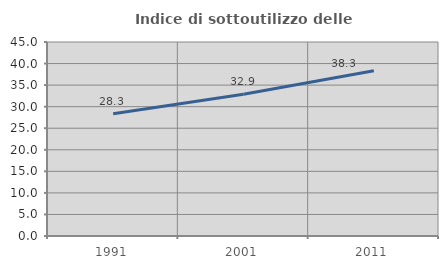
| Category | Indice di sottoutilizzo delle abitazioni  |
|---|---|
| 1991.0 | 28.337 |
| 2001.0 | 32.886 |
| 2011.0 | 38.346 |